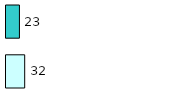
| Category | Series 0 | Series 1 |
|---|---|---|
| 0 | 32 | 23 |